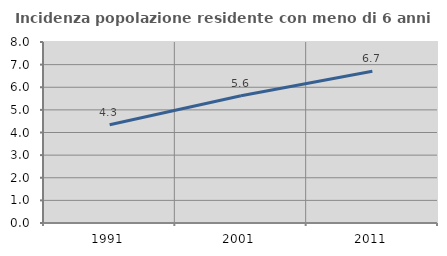
| Category | Incidenza popolazione residente con meno di 6 anni |
|---|---|
| 1991.0 | 4.341 |
| 2001.0 | 5.624 |
| 2011.0 | 6.706 |